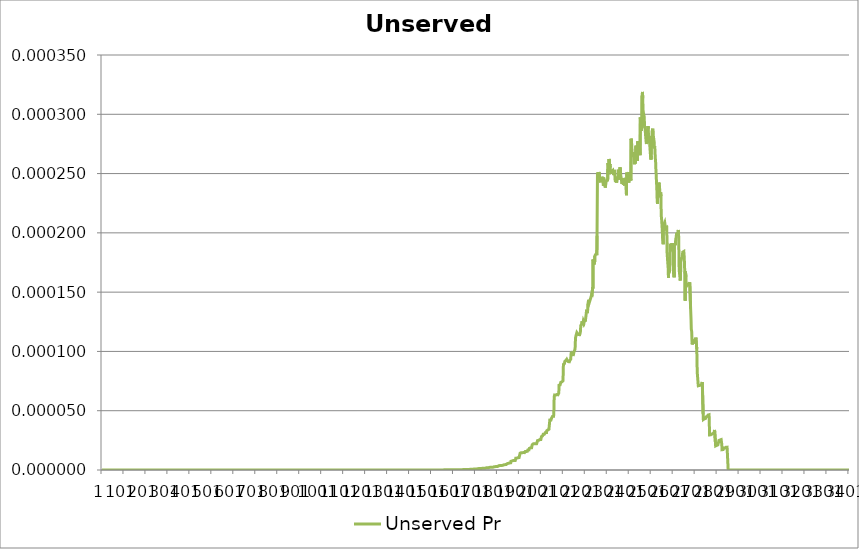
| Category | Unserved Pr |
|---|---|
| 0 | 0 |
| 1 | 0 |
| 2 | 0 |
| 3 | 0 |
| 4 | 0 |
| 5 | 0 |
| 6 | 0 |
| 7 | 0 |
| 8 | 0 |
| 9 | 0 |
| 10 | 0 |
| 11 | 0 |
| 12 | 0 |
| 13 | 0 |
| 14 | 0 |
| 15 | 0 |
| 16 | 0 |
| 17 | 0 |
| 18 | 0 |
| 19 | 0 |
| 20 | 0 |
| 21 | 0 |
| 22 | 0 |
| 23 | 0 |
| 24 | 0 |
| 25 | 0 |
| 26 | 0 |
| 27 | 0 |
| 28 | 0 |
| 29 | 0 |
| 30 | 0 |
| 31 | 0 |
| 32 | 0 |
| 33 | 0 |
| 34 | 0 |
| 35 | 0 |
| 36 | 0 |
| 37 | 0 |
| 38 | 0 |
| 39 | 0 |
| 40 | 0 |
| 41 | 0 |
| 42 | 0 |
| 43 | 0 |
| 44 | 0 |
| 45 | 0 |
| 46 | 0 |
| 47 | 0 |
| 48 | 0 |
| 49 | 0 |
| 50 | 0 |
| 51 | 0 |
| 52 | 0 |
| 53 | 0 |
| 54 | 0 |
| 55 | 0 |
| 56 | 0 |
| 57 | 0 |
| 58 | 0 |
| 59 | 0 |
| 60 | 0 |
| 61 | 0 |
| 62 | 0 |
| 63 | 0 |
| 64 | 0 |
| 65 | 0 |
| 66 | 0 |
| 67 | 0 |
| 68 | 0 |
| 69 | 0 |
| 70 | 0 |
| 71 | 0 |
| 72 | 0 |
| 73 | 0 |
| 74 | 0 |
| 75 | 0 |
| 76 | 0 |
| 77 | 0 |
| 78 | 0 |
| 79 | 0 |
| 80 | 0 |
| 81 | 0 |
| 82 | 0 |
| 83 | 0 |
| 84 | 0 |
| 85 | 0 |
| 86 | 0 |
| 87 | 0 |
| 88 | 0 |
| 89 | 0 |
| 90 | 0 |
| 91 | 0 |
| 92 | 0 |
| 93 | 0 |
| 94 | 0 |
| 95 | 0 |
| 96 | 0 |
| 97 | 0 |
| 98 | 0 |
| 99 | 0 |
| 100 | 0 |
| 101 | 0 |
| 102 | 0 |
| 103 | 0 |
| 104 | 0 |
| 105 | 0 |
| 106 | 0 |
| 107 | 0 |
| 108 | 0 |
| 109 | 0 |
| 110 | 0 |
| 111 | 0 |
| 112 | 0 |
| 113 | 0 |
| 114 | 0 |
| 115 | 0 |
| 116 | 0 |
| 117 | 0 |
| 118 | 0 |
| 119 | 0 |
| 120 | 0 |
| 121 | 0 |
| 122 | 0 |
| 123 | 0 |
| 124 | 0 |
| 125 | 0 |
| 126 | 0 |
| 127 | 0 |
| 128 | 0 |
| 129 | 0 |
| 130 | 0 |
| 131 | 0 |
| 132 | 0 |
| 133 | 0 |
| 134 | 0 |
| 135 | 0 |
| 136 | 0 |
| 137 | 0 |
| 138 | 0 |
| 139 | 0 |
| 140 | 0 |
| 141 | 0 |
| 142 | 0 |
| 143 | 0 |
| 144 | 0 |
| 145 | 0 |
| 146 | 0 |
| 147 | 0 |
| 148 | 0 |
| 149 | 0 |
| 150 | 0 |
| 151 | 0 |
| 152 | 0 |
| 153 | 0 |
| 154 | 0 |
| 155 | 0 |
| 156 | 0 |
| 157 | 0 |
| 158 | 0 |
| 159 | 0 |
| 160 | 0 |
| 161 | 0 |
| 162 | 0 |
| 163 | 0 |
| 164 | 0 |
| 165 | 0 |
| 166 | 0 |
| 167 | 0 |
| 168 | 0 |
| 169 | 0 |
| 170 | 0 |
| 171 | 0 |
| 172 | 0 |
| 173 | 0 |
| 174 | 0 |
| 175 | 0 |
| 176 | 0 |
| 177 | 0 |
| 178 | 0 |
| 179 | 0 |
| 180 | 0 |
| 181 | 0 |
| 182 | 0 |
| 183 | 0 |
| 184 | 0 |
| 185 | 0 |
| 186 | 0 |
| 187 | 0 |
| 188 | 0 |
| 189 | 0 |
| 190 | 0 |
| 191 | 0 |
| 192 | 0 |
| 193 | 0 |
| 194 | 0 |
| 195 | 0 |
| 196 | 0 |
| 197 | 0 |
| 198 | 0 |
| 199 | 0 |
| 200 | 0 |
| 201 | 0 |
| 202 | 0 |
| 203 | 0 |
| 204 | 0 |
| 205 | 0 |
| 206 | 0 |
| 207 | 0 |
| 208 | 0 |
| 209 | 0 |
| 210 | 0 |
| 211 | 0 |
| 212 | 0 |
| 213 | 0 |
| 214 | 0 |
| 215 | 0 |
| 216 | 0 |
| 217 | 0 |
| 218 | 0 |
| 219 | 0 |
| 220 | 0 |
| 221 | 0 |
| 222 | 0 |
| 223 | 0 |
| 224 | 0 |
| 225 | 0 |
| 226 | 0 |
| 227 | 0 |
| 228 | 0 |
| 229 | 0 |
| 230 | 0 |
| 231 | 0 |
| 232 | 0 |
| 233 | 0 |
| 234 | 0 |
| 235 | 0 |
| 236 | 0 |
| 237 | 0 |
| 238 | 0 |
| 239 | 0 |
| 240 | 0 |
| 241 | 0 |
| 242 | 0 |
| 243 | 0 |
| 244 | 0 |
| 245 | 0 |
| 246 | 0 |
| 247 | 0 |
| 248 | 0 |
| 249 | 0 |
| 250 | 0 |
| 251 | 0 |
| 252 | 0 |
| 253 | 0 |
| 254 | 0 |
| 255 | 0 |
| 256 | 0 |
| 257 | 0 |
| 258 | 0 |
| 259 | 0 |
| 260 | 0 |
| 261 | 0 |
| 262 | 0 |
| 263 | 0 |
| 264 | 0 |
| 265 | 0 |
| 266 | 0 |
| 267 | 0 |
| 268 | 0 |
| 269 | 0 |
| 270 | 0 |
| 271 | 0 |
| 272 | 0 |
| 273 | 0 |
| 274 | 0 |
| 275 | 0 |
| 276 | 0 |
| 277 | 0 |
| 278 | 0 |
| 279 | 0 |
| 280 | 0 |
| 281 | 0 |
| 282 | 0 |
| 283 | 0 |
| 284 | 0 |
| 285 | 0 |
| 286 | 0 |
| 287 | 0 |
| 288 | 0 |
| 289 | 0 |
| 290 | 0 |
| 291 | 0 |
| 292 | 0 |
| 293 | 0 |
| 294 | 0 |
| 295 | 0 |
| 296 | 0 |
| 297 | 0 |
| 298 | 0 |
| 299 | 0 |
| 300 | 0 |
| 301 | 0 |
| 302 | 0 |
| 303 | 0 |
| 304 | 0 |
| 305 | 0 |
| 306 | 0 |
| 307 | 0 |
| 308 | 0 |
| 309 | 0 |
| 310 | 0 |
| 311 | 0 |
| 312 | 0 |
| 313 | 0 |
| 314 | 0 |
| 315 | 0 |
| 316 | 0 |
| 317 | 0 |
| 318 | 0 |
| 319 | 0 |
| 320 | 0 |
| 321 | 0 |
| 322 | 0 |
| 323 | 0 |
| 324 | 0 |
| 325 | 0 |
| 326 | 0 |
| 327 | 0 |
| 328 | 0 |
| 329 | 0 |
| 330 | 0 |
| 331 | 0 |
| 332 | 0 |
| 333 | 0 |
| 334 | 0 |
| 335 | 0 |
| 336 | 0 |
| 337 | 0 |
| 338 | 0 |
| 339 | 0 |
| 340 | 0 |
| 341 | 0 |
| 342 | 0 |
| 343 | 0 |
| 344 | 0 |
| 345 | 0 |
| 346 | 0 |
| 347 | 0 |
| 348 | 0 |
| 349 | 0 |
| 350 | 0 |
| 351 | 0 |
| 352 | 0 |
| 353 | 0 |
| 354 | 0 |
| 355 | 0 |
| 356 | 0 |
| 357 | 0 |
| 358 | 0 |
| 359 | 0 |
| 360 | 0 |
| 361 | 0 |
| 362 | 0 |
| 363 | 0 |
| 364 | 0 |
| 365 | 0 |
| 366 | 0 |
| 367 | 0 |
| 368 | 0 |
| 369 | 0 |
| 370 | 0 |
| 371 | 0 |
| 372 | 0 |
| 373 | 0 |
| 374 | 0 |
| 375 | 0 |
| 376 | 0 |
| 377 | 0 |
| 378 | 0 |
| 379 | 0 |
| 380 | 0 |
| 381 | 0 |
| 382 | 0 |
| 383 | 0 |
| 384 | 0 |
| 385 | 0 |
| 386 | 0 |
| 387 | 0 |
| 388 | 0 |
| 389 | 0 |
| 390 | 0 |
| 391 | 0 |
| 392 | 0 |
| 393 | 0 |
| 394 | 0 |
| 395 | 0 |
| 396 | 0 |
| 397 | 0 |
| 398 | 0 |
| 399 | 0 |
| 400 | 0 |
| 401 | 0 |
| 402 | 0 |
| 403 | 0 |
| 404 | 0 |
| 405 | 0 |
| 406 | 0 |
| 407 | 0 |
| 408 | 0 |
| 409 | 0 |
| 410 | 0 |
| 411 | 0 |
| 412 | 0 |
| 413 | 0 |
| 414 | 0 |
| 415 | 0 |
| 416 | 0 |
| 417 | 0 |
| 418 | 0 |
| 419 | 0 |
| 420 | 0 |
| 421 | 0 |
| 422 | 0 |
| 423 | 0 |
| 424 | 0 |
| 425 | 0 |
| 426 | 0 |
| 427 | 0 |
| 428 | 0 |
| 429 | 0 |
| 430 | 0 |
| 431 | 0 |
| 432 | 0 |
| 433 | 0 |
| 434 | 0 |
| 435 | 0 |
| 436 | 0 |
| 437 | 0 |
| 438 | 0 |
| 439 | 0 |
| 440 | 0 |
| 441 | 0 |
| 442 | 0 |
| 443 | 0 |
| 444 | 0 |
| 445 | 0 |
| 446 | 0 |
| 447 | 0 |
| 448 | 0 |
| 449 | 0 |
| 450 | 0 |
| 451 | 0 |
| 452 | 0 |
| 453 | 0 |
| 454 | 0 |
| 455 | 0 |
| 456 | 0 |
| 457 | 0 |
| 458 | 0 |
| 459 | 0 |
| 460 | 0 |
| 461 | 0 |
| 462 | 0 |
| 463 | 0 |
| 464 | 0 |
| 465 | 0 |
| 466 | 0 |
| 467 | 0 |
| 468 | 0 |
| 469 | 0 |
| 470 | 0 |
| 471 | 0 |
| 472 | 0 |
| 473 | 0 |
| 474 | 0 |
| 475 | 0 |
| 476 | 0 |
| 477 | 0 |
| 478 | 0 |
| 479 | 0 |
| 480 | 0 |
| 481 | 0 |
| 482 | 0 |
| 483 | 0 |
| 484 | 0 |
| 485 | 0 |
| 486 | 0 |
| 487 | 0 |
| 488 | 0 |
| 489 | 0 |
| 490 | 0 |
| 491 | 0 |
| 492 | 0 |
| 493 | 0 |
| 494 | 0 |
| 495 | 0 |
| 496 | 0 |
| 497 | 0 |
| 498 | 0 |
| 499 | 0 |
| 500 | 0 |
| 501 | 0 |
| 502 | 0 |
| 503 | 0 |
| 504 | 0 |
| 505 | 0 |
| 506 | 0 |
| 507 | 0 |
| 508 | 0 |
| 509 | 0 |
| 510 | 0 |
| 511 | 0 |
| 512 | 0 |
| 513 | 0 |
| 514 | 0 |
| 515 | 0 |
| 516 | 0 |
| 517 | 0 |
| 518 | 0 |
| 519 | 0 |
| 520 | 0 |
| 521 | 0 |
| 522 | 0 |
| 523 | 0 |
| 524 | 0 |
| 525 | 0 |
| 526 | 0 |
| 527 | 0 |
| 528 | 0 |
| 529 | 0 |
| 530 | 0 |
| 531 | 0 |
| 532 | 0 |
| 533 | 0 |
| 534 | 0 |
| 535 | 0 |
| 536 | 0 |
| 537 | 0 |
| 538 | 0 |
| 539 | 0 |
| 540 | 0 |
| 541 | 0 |
| 542 | 0 |
| 543 | 0 |
| 544 | 0 |
| 545 | 0 |
| 546 | 0 |
| 547 | 0 |
| 548 | 0 |
| 549 | 0 |
| 550 | 0 |
| 551 | 0 |
| 552 | 0 |
| 553 | 0 |
| 554 | 0 |
| 555 | 0 |
| 556 | 0 |
| 557 | 0 |
| 558 | 0 |
| 559 | 0 |
| 560 | 0 |
| 561 | 0 |
| 562 | 0 |
| 563 | 0 |
| 564 | 0 |
| 565 | 0 |
| 566 | 0 |
| 567 | 0 |
| 568 | 0 |
| 569 | 0 |
| 570 | 0 |
| 571 | 0 |
| 572 | 0 |
| 573 | 0 |
| 574 | 0 |
| 575 | 0 |
| 576 | 0 |
| 577 | 0 |
| 578 | 0 |
| 579 | 0 |
| 580 | 0 |
| 581 | 0 |
| 582 | 0 |
| 583 | 0 |
| 584 | 0 |
| 585 | 0 |
| 586 | 0 |
| 587 | 0 |
| 588 | 0 |
| 589 | 0 |
| 590 | 0 |
| 591 | 0 |
| 592 | 0 |
| 593 | 0 |
| 594 | 0 |
| 595 | 0 |
| 596 | 0 |
| 597 | 0 |
| 598 | 0 |
| 599 | 0 |
| 600 | 0 |
| 601 | 0 |
| 602 | 0 |
| 603 | 0 |
| 604 | 0 |
| 605 | 0 |
| 606 | 0 |
| 607 | 0 |
| 608 | 0 |
| 609 | 0 |
| 610 | 0 |
| 611 | 0 |
| 612 | 0 |
| 613 | 0 |
| 614 | 0 |
| 615 | 0 |
| 616 | 0 |
| 617 | 0 |
| 618 | 0 |
| 619 | 0 |
| 620 | 0 |
| 621 | 0 |
| 622 | 0 |
| 623 | 0 |
| 624 | 0 |
| 625 | 0 |
| 626 | 0 |
| 627 | 0 |
| 628 | 0 |
| 629 | 0 |
| 630 | 0 |
| 631 | 0 |
| 632 | 0 |
| 633 | 0 |
| 634 | 0 |
| 635 | 0 |
| 636 | 0 |
| 637 | 0 |
| 638 | 0 |
| 639 | 0 |
| 640 | 0 |
| 641 | 0 |
| 642 | 0 |
| 643 | 0 |
| 644 | 0 |
| 645 | 0 |
| 646 | 0 |
| 647 | 0 |
| 648 | 0 |
| 649 | 0 |
| 650 | 0 |
| 651 | 0 |
| 652 | 0 |
| 653 | 0 |
| 654 | 0 |
| 655 | 0 |
| 656 | 0 |
| 657 | 0 |
| 658 | 0 |
| 659 | 0 |
| 660 | 0 |
| 661 | 0 |
| 662 | 0 |
| 663 | 0 |
| 664 | 0 |
| 665 | 0 |
| 666 | 0 |
| 667 | 0 |
| 668 | 0 |
| 669 | 0 |
| 670 | 0 |
| 671 | 0 |
| 672 | 0 |
| 673 | 0 |
| 674 | 0 |
| 675 | 0 |
| 676 | 0 |
| 677 | 0 |
| 678 | 0 |
| 679 | 0 |
| 680 | 0 |
| 681 | 0 |
| 682 | 0 |
| 683 | 0 |
| 684 | 0 |
| 685 | 0 |
| 686 | 0 |
| 687 | 0 |
| 688 | 0 |
| 689 | 0 |
| 690 | 0 |
| 691 | 0 |
| 692 | 0 |
| 693 | 0 |
| 694 | 0 |
| 695 | 0 |
| 696 | 0 |
| 697 | 0 |
| 698 | 0 |
| 699 | 0 |
| 700 | 0 |
| 701 | 0 |
| 702 | 0 |
| 703 | 0 |
| 704 | 0 |
| 705 | 0 |
| 706 | 0 |
| 707 | 0 |
| 708 | 0 |
| 709 | 0 |
| 710 | 0 |
| 711 | 0 |
| 712 | 0 |
| 713 | 0 |
| 714 | 0 |
| 715 | 0 |
| 716 | 0 |
| 717 | 0 |
| 718 | 0 |
| 719 | 0 |
| 720 | 0 |
| 721 | 0 |
| 722 | 0 |
| 723 | 0 |
| 724 | 0 |
| 725 | 0 |
| 726 | 0 |
| 727 | 0 |
| 728 | 0 |
| 729 | 0 |
| 730 | 0 |
| 731 | 0 |
| 732 | 0 |
| 733 | 0 |
| 734 | 0 |
| 735 | 0 |
| 736 | 0 |
| 737 | 0 |
| 738 | 0 |
| 739 | 0 |
| 740 | 0 |
| 741 | 0 |
| 742 | 0 |
| 743 | 0 |
| 744 | 0 |
| 745 | 0 |
| 746 | 0 |
| 747 | 0 |
| 748 | 0 |
| 749 | 0 |
| 750 | 0 |
| 751 | 0 |
| 752 | 0 |
| 753 | 0 |
| 754 | 0 |
| 755 | 0 |
| 756 | 0 |
| 757 | 0 |
| 758 | 0 |
| 759 | 0 |
| 760 | 0 |
| 761 | 0 |
| 762 | 0 |
| 763 | 0 |
| 764 | 0 |
| 765 | 0 |
| 766 | 0 |
| 767 | 0 |
| 768 | 0 |
| 769 | 0 |
| 770 | 0 |
| 771 | 0 |
| 772 | 0 |
| 773 | 0 |
| 774 | 0 |
| 775 | 0 |
| 776 | 0 |
| 777 | 0 |
| 778 | 0 |
| 779 | 0 |
| 780 | 0 |
| 781 | 0 |
| 782 | 0 |
| 783 | 0 |
| 784 | 0 |
| 785 | 0 |
| 786 | 0 |
| 787 | 0 |
| 788 | 0 |
| 789 | 0 |
| 790 | 0 |
| 791 | 0 |
| 792 | 0 |
| 793 | 0 |
| 794 | 0 |
| 795 | 0 |
| 796 | 0 |
| 797 | 0 |
| 798 | 0 |
| 799 | 0 |
| 800 | 0 |
| 801 | 0 |
| 802 | 0 |
| 803 | 0 |
| 804 | 0 |
| 805 | 0 |
| 806 | 0 |
| 807 | 0 |
| 808 | 0 |
| 809 | 0 |
| 810 | 0 |
| 811 | 0 |
| 812 | 0 |
| 813 | 0 |
| 814 | 0 |
| 815 | 0 |
| 816 | 0 |
| 817 | 0 |
| 818 | 0 |
| 819 | 0 |
| 820 | 0 |
| 821 | 0 |
| 822 | 0 |
| 823 | 0 |
| 824 | 0 |
| 825 | 0 |
| 826 | 0 |
| 827 | 0 |
| 828 | 0 |
| 829 | 0 |
| 830 | 0 |
| 831 | 0 |
| 832 | 0 |
| 833 | 0 |
| 834 | 0 |
| 835 | 0 |
| 836 | 0 |
| 837 | 0 |
| 838 | 0 |
| 839 | 0 |
| 840 | 0 |
| 841 | 0 |
| 842 | 0 |
| 843 | 0 |
| 844 | 0 |
| 845 | 0 |
| 846 | 0 |
| 847 | 0 |
| 848 | 0 |
| 849 | 0 |
| 850 | 0 |
| 851 | 0 |
| 852 | 0 |
| 853 | 0 |
| 854 | 0 |
| 855 | 0 |
| 856 | 0 |
| 857 | 0 |
| 858 | 0 |
| 859 | 0 |
| 860 | 0 |
| 861 | 0 |
| 862 | 0 |
| 863 | 0 |
| 864 | 0 |
| 865 | 0 |
| 866 | 0 |
| 867 | 0 |
| 868 | 0 |
| 869 | 0 |
| 870 | 0 |
| 871 | 0 |
| 872 | 0 |
| 873 | 0 |
| 874 | 0 |
| 875 | 0 |
| 876 | 0 |
| 877 | 0 |
| 878 | 0 |
| 879 | 0 |
| 880 | 0 |
| 881 | 0 |
| 882 | 0 |
| 883 | 0 |
| 884 | 0 |
| 885 | 0 |
| 886 | 0 |
| 887 | 0 |
| 888 | 0 |
| 889 | 0 |
| 890 | 0 |
| 891 | 0 |
| 892 | 0 |
| 893 | 0 |
| 894 | 0 |
| 895 | 0 |
| 896 | 0 |
| 897 | 0 |
| 898 | 0 |
| 899 | 0 |
| 900 | 0 |
| 901 | 0 |
| 902 | 0 |
| 903 | 0 |
| 904 | 0 |
| 905 | 0 |
| 906 | 0 |
| 907 | 0 |
| 908 | 0 |
| 909 | 0 |
| 910 | 0 |
| 911 | 0 |
| 912 | 0 |
| 913 | 0 |
| 914 | 0 |
| 915 | 0 |
| 916 | 0 |
| 917 | 0 |
| 918 | 0 |
| 919 | 0 |
| 920 | 0 |
| 921 | 0 |
| 922 | 0 |
| 923 | 0 |
| 924 | 0 |
| 925 | 0 |
| 926 | 0 |
| 927 | 0 |
| 928 | 0 |
| 929 | 0 |
| 930 | 0 |
| 931 | 0 |
| 932 | 0 |
| 933 | 0 |
| 934 | 0 |
| 935 | 0 |
| 936 | 0 |
| 937 | 0 |
| 938 | 0 |
| 939 | 0 |
| 940 | 0 |
| 941 | 0 |
| 942 | 0 |
| 943 | 0 |
| 944 | 0 |
| 945 | 0 |
| 946 | 0 |
| 947 | 0 |
| 948 | 0 |
| 949 | 0 |
| 950 | 0 |
| 951 | 0 |
| 952 | 0 |
| 953 | 0 |
| 954 | 0 |
| 955 | 0 |
| 956 | 0 |
| 957 | 0 |
| 958 | 0 |
| 959 | 0 |
| 960 | 0 |
| 961 | 0 |
| 962 | 0 |
| 963 | 0 |
| 964 | 0 |
| 965 | 0 |
| 966 | 0 |
| 967 | 0 |
| 968 | 0 |
| 969 | 0 |
| 970 | 0 |
| 971 | 0 |
| 972 | 0 |
| 973 | 0 |
| 974 | 0 |
| 975 | 0 |
| 976 | 0 |
| 977 | 0 |
| 978 | 0 |
| 979 | 0 |
| 980 | 0 |
| 981 | 0 |
| 982 | 0 |
| 983 | 0 |
| 984 | 0 |
| 985 | 0 |
| 986 | 0 |
| 987 | 0 |
| 988 | 0 |
| 989 | 0 |
| 990 | 0 |
| 991 | 0 |
| 992 | 0 |
| 993 | 0 |
| 994 | 0 |
| 995 | 0 |
| 996 | 0 |
| 997 | 0 |
| 998 | 0 |
| 999 | 0 |
| 1000 | 0 |
| 1001 | 0 |
| 1002 | 0 |
| 1003 | 0 |
| 1004 | 0 |
| 1005 | 0 |
| 1006 | 0 |
| 1007 | 0 |
| 1008 | 0 |
| 1009 | 0 |
| 1010 | 0 |
| 1011 | 0 |
| 1012 | 0 |
| 1013 | 0 |
| 1014 | 0 |
| 1015 | 0 |
| 1016 | 0 |
| 1017 | 0 |
| 1018 | 0 |
| 1019 | 0 |
| 1020 | 0 |
| 1021 | 0 |
| 1022 | 0 |
| 1023 | 0 |
| 1024 | 0 |
| 1025 | 0 |
| 1026 | 0 |
| 1027 | 0 |
| 1028 | 0 |
| 1029 | 0 |
| 1030 | 0 |
| 1031 | 0 |
| 1032 | 0 |
| 1033 | 0 |
| 1034 | 0 |
| 1035 | 0 |
| 1036 | 0 |
| 1037 | 0 |
| 1038 | 0 |
| 1039 | 0 |
| 1040 | 0 |
| 1041 | 0 |
| 1042 | 0 |
| 1043 | 0 |
| 1044 | 0 |
| 1045 | 0 |
| 1046 | 0 |
| 1047 | 0 |
| 1048 | 0 |
| 1049 | 0 |
| 1050 | 0 |
| 1051 | 0 |
| 1052 | 0 |
| 1053 | 0 |
| 1054 | 0 |
| 1055 | 0 |
| 1056 | 0 |
| 1057 | 0 |
| 1058 | 0 |
| 1059 | 0 |
| 1060 | 0 |
| 1061 | 0 |
| 1062 | 0 |
| 1063 | 0 |
| 1064 | 0 |
| 1065 | 0 |
| 1066 | 0 |
| 1067 | 0 |
| 1068 | 0 |
| 1069 | 0 |
| 1070 | 0 |
| 1071 | 0 |
| 1072 | 0 |
| 1073 | 0 |
| 1074 | 0 |
| 1075 | 0 |
| 1076 | 0 |
| 1077 | 0 |
| 1078 | 0 |
| 1079 | 0 |
| 1080 | 0 |
| 1081 | 0 |
| 1082 | 0 |
| 1083 | 0 |
| 1084 | 0 |
| 1085 | 0 |
| 1086 | 0 |
| 1087 | 0 |
| 1088 | 0 |
| 1089 | 0 |
| 1090 | 0 |
| 1091 | 0 |
| 1092 | 0 |
| 1093 | 0 |
| 1094 | 0 |
| 1095 | 0 |
| 1096 | 0 |
| 1097 | 0 |
| 1098 | 0 |
| 1099 | 0 |
| 1100 | 0 |
| 1101 | 0 |
| 1102 | 0 |
| 1103 | 0 |
| 1104 | 0 |
| 1105 | 0 |
| 1106 | 0 |
| 1107 | 0 |
| 1108 | 0 |
| 1109 | 0 |
| 1110 | 0 |
| 1111 | 0 |
| 1112 | 0 |
| 1113 | 0 |
| 1114 | 0 |
| 1115 | 0 |
| 1116 | 0 |
| 1117 | 0 |
| 1118 | 0 |
| 1119 | 0 |
| 1120 | 0 |
| 1121 | 0 |
| 1122 | 0 |
| 1123 | 0 |
| 1124 | 0 |
| 1125 | 0 |
| 1126 | 0 |
| 1127 | 0 |
| 1128 | 0 |
| 1129 | 0 |
| 1130 | 0 |
| 1131 | 0 |
| 1132 | 0 |
| 1133 | 0 |
| 1134 | 0 |
| 1135 | 0 |
| 1136 | 0 |
| 1137 | 0 |
| 1138 | 0 |
| 1139 | 0 |
| 1140 | 0 |
| 1141 | 0 |
| 1142 | 0 |
| 1143 | 0 |
| 1144 | 0 |
| 1145 | 0 |
| 1146 | 0 |
| 1147 | 0 |
| 1148 | 0 |
| 1149 | 0 |
| 1150 | 0 |
| 1151 | 0 |
| 1152 | 0 |
| 1153 | 0 |
| 1154 | 0 |
| 1155 | 0 |
| 1156 | 0 |
| 1157 | 0 |
| 1158 | 0 |
| 1159 | 0 |
| 1160 | 0 |
| 1161 | 0 |
| 1162 | 0 |
| 1163 | 0 |
| 1164 | 0 |
| 1165 | 0 |
| 1166 | 0 |
| 1167 | 0 |
| 1168 | 0 |
| 1169 | 0 |
| 1170 | 0 |
| 1171 | 0 |
| 1172 | 0 |
| 1173 | 0 |
| 1174 | 0 |
| 1175 | 0 |
| 1176 | 0 |
| 1177 | 0 |
| 1178 | 0 |
| 1179 | 0 |
| 1180 | 0 |
| 1181 | 0 |
| 1182 | 0 |
| 1183 | 0 |
| 1184 | 0 |
| 1185 | 0 |
| 1186 | 0 |
| 1187 | 0 |
| 1188 | 0 |
| 1189 | 0 |
| 1190 | 0 |
| 1191 | 0 |
| 1192 | 0 |
| 1193 | 0 |
| 1194 | 0 |
| 1195 | 0 |
| 1196 | 0 |
| 1197 | 0 |
| 1198 | 0 |
| 1199 | 0 |
| 1200 | 0 |
| 1201 | 0 |
| 1202 | 0 |
| 1203 | 0 |
| 1204 | 0 |
| 1205 | 0 |
| 1206 | 0 |
| 1207 | 0 |
| 1208 | 0 |
| 1209 | 0 |
| 1210 | 0 |
| 1211 | 0 |
| 1212 | 0 |
| 1213 | 0 |
| 1214 | 0 |
| 1215 | 0 |
| 1216 | 0 |
| 1217 | 0 |
| 1218 | 0 |
| 1219 | 0 |
| 1220 | 0 |
| 1221 | 0 |
| 1222 | 0 |
| 1223 | 0 |
| 1224 | 0 |
| 1225 | 0 |
| 1226 | 0 |
| 1227 | 0 |
| 1228 | 0 |
| 1229 | 0 |
| 1230 | 0 |
| 1231 | 0 |
| 1232 | 0 |
| 1233 | 0 |
| 1234 | 0 |
| 1235 | 0 |
| 1236 | 0 |
| 1237 | 0 |
| 1238 | 0 |
| 1239 | 0 |
| 1240 | 0 |
| 1241 | 0 |
| 1242 | 0 |
| 1243 | 0 |
| 1244 | 0 |
| 1245 | 0 |
| 1246 | 0 |
| 1247 | 0 |
| 1248 | 0 |
| 1249 | 0 |
| 1250 | 0 |
| 1251 | 0 |
| 1252 | 0 |
| 1253 | 0 |
| 1254 | 0 |
| 1255 | 0 |
| 1256 | 0 |
| 1257 | 0 |
| 1258 | 0 |
| 1259 | 0 |
| 1260 | 0 |
| 1261 | 0 |
| 1262 | 0 |
| 1263 | 0 |
| 1264 | 0 |
| 1265 | 0 |
| 1266 | 0 |
| 1267 | 0 |
| 1268 | 0 |
| 1269 | 0 |
| 1270 | 0 |
| 1271 | 0 |
| 1272 | 0 |
| 1273 | 0 |
| 1274 | 0 |
| 1275 | 0 |
| 1276 | 0 |
| 1277 | 0 |
| 1278 | 0 |
| 1279 | 0 |
| 1280 | 0 |
| 1281 | 0 |
| 1282 | 0 |
| 1283 | 0 |
| 1284 | 0 |
| 1285 | 0 |
| 1286 | 0 |
| 1287 | 0 |
| 1288 | 0 |
| 1289 | 0 |
| 1290 | 0 |
| 1291 | 0 |
| 1292 | 0 |
| 1293 | 0 |
| 1294 | 0 |
| 1295 | 0 |
| 1296 | 0 |
| 1297 | 0 |
| 1298 | 0 |
| 1299 | 0 |
| 1300 | 0 |
| 1301 | 0 |
| 1302 | 0 |
| 1303 | 0 |
| 1304 | 0 |
| 1305 | 0 |
| 1306 | 0 |
| 1307 | 0 |
| 1308 | 0 |
| 1309 | 0 |
| 1310 | 0 |
| 1311 | 0 |
| 1312 | 0 |
| 1313 | 0 |
| 1314 | 0 |
| 1315 | 0 |
| 1316 | 0 |
| 1317 | 0 |
| 1318 | 0 |
| 1319 | 0 |
| 1320 | 0 |
| 1321 | 0 |
| 1322 | 0 |
| 1323 | 0 |
| 1324 | 0 |
| 1325 | 0 |
| 1326 | 0 |
| 1327 | 0 |
| 1328 | 0 |
| 1329 | 0 |
| 1330 | 0 |
| 1331 | 0 |
| 1332 | 0 |
| 1333 | 0 |
| 1334 | 0 |
| 1335 | 0 |
| 1336 | 0 |
| 1337 | 0 |
| 1338 | 0 |
| 1339 | 0 |
| 1340 | 0 |
| 1341 | 0 |
| 1342 | 0 |
| 1343 | 0 |
| 1344 | 0 |
| 1345 | 0 |
| 1346 | 0 |
| 1347 | 0 |
| 1348 | 0 |
| 1349 | 0 |
| 1350 | 0 |
| 1351 | 0 |
| 1352 | 0 |
| 1353 | 0 |
| 1354 | 0 |
| 1355 | 0 |
| 1356 | 0 |
| 1357 | 0 |
| 1358 | 0 |
| 1359 | 0 |
| 1360 | 0 |
| 1361 | 0 |
| 1362 | 0 |
| 1363 | 0 |
| 1364 | 0 |
| 1365 | 0 |
| 1366 | 0 |
| 1367 | 0 |
| 1368 | 0 |
| 1369 | 0 |
| 1370 | 0 |
| 1371 | 0 |
| 1372 | 0 |
| 1373 | 0 |
| 1374 | 0 |
| 1375 | 0 |
| 1376 | 0 |
| 1377 | 0 |
| 1378 | 0 |
| 1379 | 0 |
| 1380 | 0 |
| 1381 | 0 |
| 1382 | 0 |
| 1383 | 0 |
| 1384 | 0 |
| 1385 | 0 |
| 1386 | 0 |
| 1387 | 0 |
| 1388 | 0 |
| 1389 | 0 |
| 1390 | 0 |
| 1391 | 0 |
| 1392 | 0 |
| 1393 | 0 |
| 1394 | 0 |
| 1395 | 0 |
| 1396 | 0 |
| 1397 | 0 |
| 1398 | 0 |
| 1399 | 0 |
| 1400 | 0 |
| 1401 | 0 |
| 1402 | 0 |
| 1403 | 0 |
| 1404 | 0 |
| 1405 | 0 |
| 1406 | 0 |
| 1407 | 0 |
| 1408 | 0 |
| 1409 | 0 |
| 1410 | 0 |
| 1411 | 0 |
| 1412 | 0 |
| 1413 | 0 |
| 1414 | 0 |
| 1415 | 0 |
| 1416 | 0 |
| 1417 | 0 |
| 1418 | 0 |
| 1419 | 0 |
| 1420 | 0 |
| 1421 | 0 |
| 1422 | 0 |
| 1423 | 0 |
| 1424 | 0 |
| 1425 | 0 |
| 1426 | 0 |
| 1427 | 0 |
| 1428 | 0 |
| 1429 | 0 |
| 1430 | 0 |
| 1431 | 0 |
| 1432 | 0 |
| 1433 | 0 |
| 1434 | 0 |
| 1435 | 0 |
| 1436 | 0 |
| 1437 | 0 |
| 1438 | 0 |
| 1439 | 0 |
| 1440 | 0 |
| 1441 | 0 |
| 1442 | 0 |
| 1443 | 0 |
| 1444 | 0 |
| 1445 | 0 |
| 1446 | 0 |
| 1447 | 0 |
| 1448 | 0 |
| 1449 | 0 |
| 1450 | 0 |
| 1451 | 0 |
| 1452 | 0 |
| 1453 | 0 |
| 1454 | 0 |
| 1455 | 0 |
| 1456 | 0 |
| 1457 | 0 |
| 1458 | 0 |
| 1459 | 0 |
| 1460 | 0 |
| 1461 | 0 |
| 1462 | 0 |
| 1463 | 0 |
| 1464 | 0 |
| 1465 | 0 |
| 1466 | 0 |
| 1467 | 0 |
| 1468 | 0 |
| 1469 | 0 |
| 1470 | 0 |
| 1471 | 0 |
| 1472 | 0 |
| 1473 | 0 |
| 1474 | 0 |
| 1475 | 0 |
| 1476 | 0 |
| 1477 | 0 |
| 1478 | 0 |
| 1479 | 0 |
| 1480 | 0 |
| 1481 | 0 |
| 1482 | 0 |
| 1483 | 0 |
| 1484 | 0 |
| 1485 | 0 |
| 1486 | 0 |
| 1487 | 0 |
| 1488 | 0 |
| 1489 | 0 |
| 1490 | 0 |
| 1491 | 0 |
| 1492 | 0 |
| 1493 | 0 |
| 1494 | 0 |
| 1495 | 0 |
| 1496 | 0 |
| 1497 | 0 |
| 1498 | 0 |
| 1499 | 0 |
| 1500 | 0 |
| 1501 | 0 |
| 1502 | 0 |
| 1503 | 0 |
| 1504 | 0 |
| 1505 | 0 |
| 1506 | 0 |
| 1507 | 0 |
| 1508 | 0 |
| 1509 | 0 |
| 1510 | 0 |
| 1511 | 0 |
| 1512 | 0 |
| 1513 | 0 |
| 1514 | 0 |
| 1515 | 0 |
| 1516 | 0 |
| 1517 | 0 |
| 1518 | 0 |
| 1519 | 0 |
| 1520 | 0 |
| 1521 | 0 |
| 1522 | 0 |
| 1523 | 0 |
| 1524 | 0 |
| 1525 | 0 |
| 1526 | 0 |
| 1527 | 0 |
| 1528 | 0 |
| 1529 | 0 |
| 1530 | 0 |
| 1531 | 0 |
| 1532 | 0 |
| 1533 | 0 |
| 1534 | 0 |
| 1535 | 0 |
| 1536 | 0 |
| 1537 | 0 |
| 1538 | 0 |
| 1539 | 0 |
| 1540 | 0 |
| 1541 | 0 |
| 1542 | 0 |
| 1543 | 0 |
| 1544 | 0 |
| 1545 | 0 |
| 1546 | 0 |
| 1547 | 0 |
| 1548 | 0 |
| 1549 | 0 |
| 1550 | 0 |
| 1551 | 0 |
| 1552 | 0 |
| 1553 | 0 |
| 1554 | 0 |
| 1555 | 0 |
| 1556 | 0 |
| 1557 | 0 |
| 1558 | 0 |
| 1559 | 0 |
| 1560 | 0 |
| 1561 | 0 |
| 1562 | 0 |
| 1563 | 0 |
| 1564 | 0 |
| 1565 | 0 |
| 1566 | 0 |
| 1567 | 0 |
| 1568 | 0 |
| 1569 | 0 |
| 1570 | 0 |
| 1571 | 0 |
| 1572 | 0 |
| 1573 | 0 |
| 1574 | 0 |
| 1575 | 0 |
| 1576 | 0 |
| 1577 | 0 |
| 1578 | 0 |
| 1579 | 0 |
| 1580 | 0 |
| 1581 | 0 |
| 1582 | 0 |
| 1583 | 0 |
| 1584 | 0 |
| 1585 | 0 |
| 1586 | 0 |
| 1587 | 0 |
| 1588 | 0 |
| 1589 | 0 |
| 1590 | 0 |
| 1591 | 0 |
| 1592 | 0 |
| 1593 | 0 |
| 1594 | 0 |
| 1595 | 0 |
| 1596 | 0 |
| 1597 | 0 |
| 1598 | 0 |
| 1599 | 0 |
| 1600 | 0 |
| 1601 | 0 |
| 1602 | 0 |
| 1603 | 0 |
| 1604 | 0 |
| 1605 | 0 |
| 1606 | 0 |
| 1607 | 0 |
| 1608 | 0 |
| 1609 | 0 |
| 1610 | 0 |
| 1611 | 0 |
| 1612 | 0 |
| 1613 | 0 |
| 1614 | 0 |
| 1615 | 0 |
| 1616 | 0 |
| 1617 | 0 |
| 1618 | 0 |
| 1619 | 0 |
| 1620 | 0 |
| 1621 | 0 |
| 1622 | 0 |
| 1623 | 0 |
| 1624 | 0 |
| 1625 | 0 |
| 1626 | 0 |
| 1627 | 0 |
| 1628 | 0 |
| 1629 | 0 |
| 1630 | 0 |
| 1631 | 0 |
| 1632 | 0 |
| 1633 | 0 |
| 1634 | 0 |
| 1635 | 0 |
| 1636 | 0 |
| 1637 | 0 |
| 1638 | 0 |
| 1639 | 0 |
| 1640 | 0 |
| 1641 | 0 |
| 1642 | 0 |
| 1643 | 0 |
| 1644 | 0 |
| 1645 | 0 |
| 1646 | 0 |
| 1647 | 0 |
| 1648 | 0 |
| 1649 | 0 |
| 1650 | 0 |
| 1651 | 0 |
| 1652 | 0 |
| 1653 | 0 |
| 1654 | 0 |
| 1655 | 0 |
| 1656 | 0 |
| 1657 | 0 |
| 1658 | 0 |
| 1659 | 0 |
| 1660 | 0 |
| 1661 | 0 |
| 1662 | 0 |
| 1663 | 0 |
| 1664 | 0 |
| 1665 | 0 |
| 1666 | 0 |
| 1667 | 0 |
| 1668 | 0 |
| 1669 | 0 |
| 1670 | 0 |
| 1671 | 0 |
| 1672 | 0 |
| 1673 | 0 |
| 1674 | 0 |
| 1675 | 0 |
| 1676 | 0 |
| 1677 | 0 |
| 1678 | 0 |
| 1679 | 0 |
| 1680 | 0 |
| 1681 | 0 |
| 1682 | 0 |
| 1683 | 0 |
| 1684 | 0 |
| 1685 | 0 |
| 1686 | 0 |
| 1687 | 0 |
| 1688 | 0 |
| 1689 | 0 |
| 1690 | 0 |
| 1691 | 0 |
| 1692 | 0 |
| 1693 | 0 |
| 1694 | 0 |
| 1695 | 0 |
| 1696 | 0 |
| 1697 | 0 |
| 1698 | 0 |
| 1699 | 0 |
| 1700 | 0 |
| 1701 | 0 |
| 1702 | 0 |
| 1703 | 0 |
| 1704 | 0 |
| 1705 | 0 |
| 1706 | 0 |
| 1707 | 0 |
| 1708 | 0 |
| 1709 | 0 |
| 1710 | 0 |
| 1711 | 0 |
| 1712 | 0 |
| 1713 | 0 |
| 1714 | 0 |
| 1715 | 0 |
| 1716 | 0 |
| 1717 | 0 |
| 1718 | 0 |
| 1719 | 0 |
| 1720 | 0 |
| 1721 | 0 |
| 1722 | 0 |
| 1723 | 0 |
| 1724 | 0 |
| 1725 | 0 |
| 1726 | 0 |
| 1727 | 0 |
| 1728 | 0 |
| 1729 | 0 |
| 1730 | 0 |
| 1731 | 0 |
| 1732 | 0 |
| 1733 | 0 |
| 1734 | 0 |
| 1735 | 0 |
| 1736 | 0 |
| 1737 | 0 |
| 1738 | 0 |
| 1739 | 0 |
| 1740 | 0 |
| 1741 | 0 |
| 1742 | 0 |
| 1743 | 0 |
| 1744 | 0 |
| 1745 | 0 |
| 1746 | 0 |
| 1747 | 0 |
| 1748 | 0 |
| 1749 | 0 |
| 1750 | 0 |
| 1751 | 0 |
| 1752 | 0 |
| 1753 | 0 |
| 1754 | 0 |
| 1755 | 0 |
| 1756 | 0 |
| 1757 | 0 |
| 1758 | 0 |
| 1759 | 0 |
| 1760 | 0 |
| 1761 | 0 |
| 1762 | 0 |
| 1763 | 0 |
| 1764 | 0 |
| 1765 | 0 |
| 1766 | 0 |
| 1767 | 0 |
| 1768 | 0 |
| 1769 | 0 |
| 1770 | 0 |
| 1771 | 0 |
| 1772 | 0 |
| 1773 | 0 |
| 1774 | 0 |
| 1775 | 0 |
| 1776 | 0 |
| 1777 | 0 |
| 1778 | 0 |
| 1779 | 0 |
| 1780 | 0 |
| 1781 | 0 |
| 1782 | 0 |
| 1783 | 0 |
| 1784 | 0 |
| 1785 | 0 |
| 1786 | 0 |
| 1787 | 0 |
| 1788 | 0 |
| 1789 | 0 |
| 1790 | 0 |
| 1791 | 0 |
| 1792 | 0 |
| 1793 | 0 |
| 1794 | 0 |
| 1795 | 0 |
| 1796 | 0 |
| 1797 | 0 |
| 1798 | 0 |
| 1799 | 0 |
| 1800 | 0 |
| 1801 | 0 |
| 1802 | 0 |
| 1803 | 0 |
| 1804 | 0 |
| 1805 | 0 |
| 1806 | 0 |
| 1807 | 0 |
| 1808 | 0 |
| 1809 | 0 |
| 1810 | 0 |
| 1811 | 0 |
| 1812 | 0 |
| 1813 | 0 |
| 1814 | 0 |
| 1815 | 0 |
| 1816 | 0 |
| 1817 | 0 |
| 1818 | 0 |
| 1819 | 0 |
| 1820 | 0 |
| 1821 | 0 |
| 1822 | 0 |
| 1823 | 0 |
| 1824 | 0 |
| 1825 | 0 |
| 1826 | 0 |
| 1827 | 0 |
| 1828 | 0 |
| 1829 | 0 |
| 1830 | 0 |
| 1831 | 0 |
| 1832 | 0 |
| 1833 | 0 |
| 1834 | 0 |
| 1835 | 0 |
| 1836 | 0 |
| 1837 | 0 |
| 1838 | 0 |
| 1839 | 0 |
| 1840 | 0 |
| 1841 | 0 |
| 1842 | 0 |
| 1843 | 0 |
| 1844 | 0 |
| 1845 | 0 |
| 1846 | 0 |
| 1847 | 0 |
| 1848 | 0 |
| 1849 | 0 |
| 1850 | 0 |
| 1851 | 0 |
| 1852 | 0 |
| 1853 | 0 |
| 1854 | 0 |
| 1855 | 0 |
| 1856 | 0 |
| 1857 | 0 |
| 1858 | 0 |
| 1859 | 0 |
| 1860 | 0 |
| 1861 | 0 |
| 1862 | 0 |
| 1863 | 0 |
| 1864 | 0 |
| 1865 | 0 |
| 1866 | 0 |
| 1867 | 0 |
| 1868 | 0 |
| 1869 | 0 |
| 1870 | 0 |
| 1871 | 0 |
| 1872 | 0 |
| 1873 | 0 |
| 1874 | 0 |
| 1875 | 0 |
| 1876 | 0 |
| 1877 | 0 |
| 1878 | 0 |
| 1879 | 0 |
| 1880 | 0 |
| 1881 | 0 |
| 1882 | 0 |
| 1883 | 0 |
| 1884 | 0 |
| 1885 | 0 |
| 1886 | 0 |
| 1887 | 0 |
| 1888 | 0 |
| 1889 | 0 |
| 1890 | 0 |
| 1891 | 0 |
| 1892 | 0 |
| 1893 | 0 |
| 1894 | 0 |
| 1895 | 0 |
| 1896 | 0 |
| 1897 | 0 |
| 1898 | 0 |
| 1899 | 0 |
| 1900 | 0 |
| 1901 | 0 |
| 1902 | 0 |
| 1903 | 0 |
| 1904 | 0 |
| 1905 | 0 |
| 1906 | 0 |
| 1907 | 0 |
| 1908 | 0 |
| 1909 | 0 |
| 1910 | 0 |
| 1911 | 0 |
| 1912 | 0 |
| 1913 | 0 |
| 1914 | 0 |
| 1915 | 0 |
| 1916 | 0 |
| 1917 | 0 |
| 1918 | 0 |
| 1919 | 0 |
| 1920 | 0 |
| 1921 | 0 |
| 1922 | 0 |
| 1923 | 0 |
| 1924 | 0 |
| 1925 | 0 |
| 1926 | 0 |
| 1927 | 0 |
| 1928 | 0 |
| 1929 | 0 |
| 1930 | 0 |
| 1931 | 0 |
| 1932 | 0 |
| 1933 | 0 |
| 1934 | 0 |
| 1935 | 0 |
| 1936 | 0 |
| 1937 | 0 |
| 1938 | 0 |
| 1939 | 0 |
| 1940 | 0 |
| 1941 | 0 |
| 1942 | 0 |
| 1943 | 0 |
| 1944 | 0 |
| 1945 | 0 |
| 1946 | 0 |
| 1947 | 0 |
| 1948 | 0 |
| 1949 | 0 |
| 1950 | 0 |
| 1951 | 0 |
| 1952 | 0 |
| 1953 | 0 |
| 1954 | 0 |
| 1955 | 0 |
| 1956 | 0 |
| 1957 | 0 |
| 1958 | 0 |
| 1959 | 0 |
| 1960 | 0 |
| 1961 | 0 |
| 1962 | 0 |
| 1963 | 0 |
| 1964 | 0 |
| 1965 | 0 |
| 1966 | 0 |
| 1967 | 0 |
| 1968 | 0 |
| 1969 | 0 |
| 1970 | 0 |
| 1971 | 0 |
| 1972 | 0 |
| 1973 | 0 |
| 1974 | 0 |
| 1975 | 0 |
| 1976 | 0 |
| 1977 | 0 |
| 1978 | 0 |
| 1979 | 0 |
| 1980 | 0 |
| 1981 | 0 |
| 1982 | 0 |
| 1983 | 0 |
| 1984 | 0 |
| 1985 | 0 |
| 1986 | 0 |
| 1987 | 0 |
| 1988 | 0 |
| 1989 | 0 |
| 1990 | 0 |
| 1991 | 0 |
| 1992 | 0 |
| 1993 | 0 |
| 1994 | 0 |
| 1995 | 0 |
| 1996 | 0 |
| 1997 | 0 |
| 1998 | 0 |
| 1999 | 0 |
| 2000 | 0 |
| 2001 | 0 |
| 2002 | 0 |
| 2003 | 0 |
| 2004 | 0 |
| 2005 | 0 |
| 2006 | 0 |
| 2007 | 0 |
| 2008 | 0 |
| 2009 | 0 |
| 2010 | 0 |
| 2011 | 0 |
| 2012 | 0 |
| 2013 | 0 |
| 2014 | 0 |
| 2015 | 0 |
| 2016 | 0 |
| 2017 | 0 |
| 2018 | 0 |
| 2019 | 0 |
| 2020 | 0 |
| 2021 | 0 |
| 2022 | 0 |
| 2023 | 0 |
| 2024 | 0 |
| 2025 | 0 |
| 2026 | 0 |
| 2027 | 0 |
| 2028 | 0 |
| 2029 | 0 |
| 2030 | 0 |
| 2031 | 0 |
| 2032 | 0 |
| 2033 | 0 |
| 2034 | 0 |
| 2035 | 0 |
| 2036 | 0 |
| 2037 | 0 |
| 2038 | 0 |
| 2039 | 0 |
| 2040 | 0 |
| 2041 | 0 |
| 2042 | 0 |
| 2043 | 0 |
| 2044 | 0 |
| 2045 | 0 |
| 2046 | 0 |
| 2047 | 0 |
| 2048 | 0 |
| 2049 | 0 |
| 2050 | 0 |
| 2051 | 0 |
| 2052 | 0 |
| 2053 | 0 |
| 2054 | 0 |
| 2055 | 0 |
| 2056 | 0 |
| 2057 | 0 |
| 2058 | 0 |
| 2059 | 0 |
| 2060 | 0 |
| 2061 | 0 |
| 2062 | 0 |
| 2063 | 0 |
| 2064 | 0 |
| 2065 | 0 |
| 2066 | 0 |
| 2067 | 0 |
| 2068 | 0 |
| 2069 | 0 |
| 2070 | 0 |
| 2071 | 0 |
| 2072 | 0 |
| 2073 | 0 |
| 2074 | 0 |
| 2075 | 0 |
| 2076 | 0 |
| 2077 | 0 |
| 2078 | 0 |
| 2079 | 0 |
| 2080 | 0 |
| 2081 | 0 |
| 2082 | 0 |
| 2083 | 0 |
| 2084 | 0 |
| 2085 | 0 |
| 2086 | 0 |
| 2087 | 0 |
| 2088 | 0 |
| 2089 | 0 |
| 2090 | 0 |
| 2091 | 0 |
| 2092 | 0 |
| 2093 | 0 |
| 2094 | 0 |
| 2095 | 0 |
| 2096 | 0 |
| 2097 | 0 |
| 2098 | 0 |
| 2099 | 0 |
| 2100 | 0 |
| 2101 | 0 |
| 2102 | 0 |
| 2103 | 0 |
| 2104 | 0 |
| 2105 | 0 |
| 2106 | 0 |
| 2107 | 0 |
| 2108 | 0 |
| 2109 | 0 |
| 2110 | 0 |
| 2111 | 0 |
| 2112 | 0 |
| 2113 | 0 |
| 2114 | 0 |
| 2115 | 0 |
| 2116 | 0 |
| 2117 | 0 |
| 2118 | 0 |
| 2119 | 0 |
| 2120 | 0 |
| 2121 | 0 |
| 2122 | 0 |
| 2123 | 0 |
| 2124 | 0 |
| 2125 | 0 |
| 2126 | 0 |
| 2127 | 0 |
| 2128 | 0 |
| 2129 | 0 |
| 2130 | 0 |
| 2131 | 0 |
| 2132 | 0 |
| 2133 | 0 |
| 2134 | 0 |
| 2135 | 0 |
| 2136 | 0 |
| 2137 | 0 |
| 2138 | 0 |
| 2139 | 0 |
| 2140 | 0 |
| 2141 | 0 |
| 2142 | 0 |
| 2143 | 0 |
| 2144 | 0 |
| 2145 | 0 |
| 2146 | 0 |
| 2147 | 0 |
| 2148 | 0 |
| 2149 | 0 |
| 2150 | 0 |
| 2151 | 0 |
| 2152 | 0 |
| 2153 | 0 |
| 2154 | 0 |
| 2155 | 0 |
| 2156 | 0 |
| 2157 | 0 |
| 2158 | 0 |
| 2159 | 0 |
| 2160 | 0 |
| 2161 | 0 |
| 2162 | 0 |
| 2163 | 0 |
| 2164 | 0 |
| 2165 | 0 |
| 2166 | 0 |
| 2167 | 0 |
| 2168 | 0 |
| 2169 | 0 |
| 2170 | 0 |
| 2171 | 0 |
| 2172 | 0 |
| 2173 | 0 |
| 2174 | 0 |
| 2175 | 0 |
| 2176 | 0 |
| 2177 | 0 |
| 2178 | 0 |
| 2179 | 0 |
| 2180 | 0 |
| 2181 | 0 |
| 2182 | 0 |
| 2183 | 0 |
| 2184 | 0 |
| 2185 | 0 |
| 2186 | 0 |
| 2187 | 0 |
| 2188 | 0 |
| 2189 | 0 |
| 2190 | 0 |
| 2191 | 0 |
| 2192 | 0 |
| 2193 | 0 |
| 2194 | 0 |
| 2195 | 0 |
| 2196 | 0 |
| 2197 | 0 |
| 2198 | 0 |
| 2199 | 0 |
| 2200 | 0 |
| 2201 | 0 |
| 2202 | 0 |
| 2203 | 0 |
| 2204 | 0 |
| 2205 | 0 |
| 2206 | 0 |
| 2207 | 0 |
| 2208 | 0 |
| 2209 | 0 |
| 2210 | 0 |
| 2211 | 0 |
| 2212 | 0 |
| 2213 | 0 |
| 2214 | 0 |
| 2215 | 0 |
| 2216 | 0 |
| 2217 | 0 |
| 2218 | 0 |
| 2219 | 0 |
| 2220 | 0 |
| 2221 | 0 |
| 2222 | 0 |
| 2223 | 0 |
| 2224 | 0 |
| 2225 | 0 |
| 2226 | 0 |
| 2227 | 0 |
| 2228 | 0 |
| 2229 | 0 |
| 2230 | 0 |
| 2231 | 0 |
| 2232 | 0 |
| 2233 | 0 |
| 2234 | 0 |
| 2235 | 0 |
| 2236 | 0 |
| 2237 | 0 |
| 2238 | 0 |
| 2239 | 0 |
| 2240 | 0 |
| 2241 | 0 |
| 2242 | 0 |
| 2243 | 0 |
| 2244 | 0 |
| 2245 | 0 |
| 2246 | 0 |
| 2247 | 0 |
| 2248 | 0 |
| 2249 | 0 |
| 2250 | 0 |
| 2251 | 0 |
| 2252 | 0 |
| 2253 | 0 |
| 2254 | 0 |
| 2255 | 0 |
| 2256 | 0 |
| 2257 | 0 |
| 2258 | 0 |
| 2259 | 0 |
| 2260 | 0 |
| 2261 | 0 |
| 2262 | 0 |
| 2263 | 0 |
| 2264 | 0 |
| 2265 | 0 |
| 2266 | 0 |
| 2267 | 0 |
| 2268 | 0 |
| 2269 | 0 |
| 2270 | 0 |
| 2271 | 0 |
| 2272 | 0 |
| 2273 | 0 |
| 2274 | 0 |
| 2275 | 0 |
| 2276 | 0 |
| 2277 | 0 |
| 2278 | 0 |
| 2279 | 0 |
| 2280 | 0 |
| 2281 | 0 |
| 2282 | 0 |
| 2283 | 0 |
| 2284 | 0 |
| 2285 | 0 |
| 2286 | 0 |
| 2287 | 0 |
| 2288 | 0 |
| 2289 | 0 |
| 2290 | 0 |
| 2291 | 0 |
| 2292 | 0 |
| 2293 | 0 |
| 2294 | 0 |
| 2295 | 0 |
| 2296 | 0 |
| 2297 | 0 |
| 2298 | 0 |
| 2299 | 0 |
| 2300 | 0 |
| 2301 | 0 |
| 2302 | 0 |
| 2303 | 0 |
| 2304 | 0 |
| 2305 | 0 |
| 2306 | 0 |
| 2307 | 0 |
| 2308 | 0 |
| 2309 | 0 |
| 2310 | 0 |
| 2311 | 0 |
| 2312 | 0 |
| 2313 | 0 |
| 2314 | 0 |
| 2315 | 0 |
| 2316 | 0 |
| 2317 | 0 |
| 2318 | 0 |
| 2319 | 0 |
| 2320 | 0 |
| 2321 | 0 |
| 2322 | 0 |
| 2323 | 0 |
| 2324 | 0 |
| 2325 | 0 |
| 2326 | 0 |
| 2327 | 0 |
| 2328 | 0 |
| 2329 | 0 |
| 2330 | 0 |
| 2331 | 0 |
| 2332 | 0 |
| 2333 | 0 |
| 2334 | 0 |
| 2335 | 0 |
| 2336 | 0 |
| 2337 | 0 |
| 2338 | 0 |
| 2339 | 0 |
| 2340 | 0 |
| 2341 | 0 |
| 2342 | 0 |
| 2343 | 0 |
| 2344 | 0 |
| 2345 | 0 |
| 2346 | 0 |
| 2347 | 0 |
| 2348 | 0 |
| 2349 | 0 |
| 2350 | 0 |
| 2351 | 0 |
| 2352 | 0 |
| 2353 | 0 |
| 2354 | 0 |
| 2355 | 0 |
| 2356 | 0 |
| 2357 | 0 |
| 2358 | 0 |
| 2359 | 0 |
| 2360 | 0 |
| 2361 | 0 |
| 2362 | 0 |
| 2363 | 0 |
| 2364 | 0 |
| 2365 | 0 |
| 2366 | 0 |
| 2367 | 0 |
| 2368 | 0 |
| 2369 | 0 |
| 2370 | 0 |
| 2371 | 0 |
| 2372 | 0 |
| 2373 | 0 |
| 2374 | 0 |
| 2375 | 0 |
| 2376 | 0 |
| 2377 | 0 |
| 2378 | 0 |
| 2379 | 0 |
| 2380 | 0 |
| 2381 | 0 |
| 2382 | 0 |
| 2383 | 0 |
| 2384 | 0 |
| 2385 | 0 |
| 2386 | 0 |
| 2387 | 0 |
| 2388 | 0 |
| 2389 | 0 |
| 2390 | 0 |
| 2391 | 0 |
| 2392 | 0 |
| 2393 | 0 |
| 2394 | 0 |
| 2395 | 0 |
| 2396 | 0 |
| 2397 | 0 |
| 2398 | 0 |
| 2399 | 0 |
| 2400 | 0 |
| 2401 | 0 |
| 2402 | 0 |
| 2403 | 0 |
| 2404 | 0 |
| 2405 | 0 |
| 2406 | 0 |
| 2407 | 0 |
| 2408 | 0 |
| 2409 | 0 |
| 2410 | 0 |
| 2411 | 0 |
| 2412 | 0 |
| 2413 | 0 |
| 2414 | 0 |
| 2415 | 0 |
| 2416 | 0 |
| 2417 | 0 |
| 2418 | 0 |
| 2419 | 0 |
| 2420 | 0 |
| 2421 | 0 |
| 2422 | 0 |
| 2423 | 0 |
| 2424 | 0 |
| 2425 | 0 |
| 2426 | 0 |
| 2427 | 0 |
| 2428 | 0 |
| 2429 | 0 |
| 2430 | 0 |
| 2431 | 0 |
| 2432 | 0 |
| 2433 | 0 |
| 2434 | 0 |
| 2435 | 0 |
| 2436 | 0 |
| 2437 | 0 |
| 2438 | 0 |
| 2439 | 0 |
| 2440 | 0 |
| 2441 | 0 |
| 2442 | 0 |
| 2443 | 0 |
| 2444 | 0 |
| 2445 | 0 |
| 2446 | 0 |
| 2447 | 0 |
| 2448 | 0 |
| 2449 | 0 |
| 2450 | 0 |
| 2451 | 0 |
| 2452 | 0 |
| 2453 | 0 |
| 2454 | 0 |
| 2455 | 0 |
| 2456 | 0 |
| 2457 | 0 |
| 2458 | 0 |
| 2459 | 0 |
| 2460 | 0 |
| 2461 | 0 |
| 2462 | 0 |
| 2463 | 0 |
| 2464 | 0 |
| 2465 | 0 |
| 2466 | 0 |
| 2467 | 0 |
| 2468 | 0 |
| 2469 | 0 |
| 2470 | 0 |
| 2471 | 0 |
| 2472 | 0 |
| 2473 | 0 |
| 2474 | 0 |
| 2475 | 0 |
| 2476 | 0 |
| 2477 | 0 |
| 2478 | 0 |
| 2479 | 0 |
| 2480 | 0 |
| 2481 | 0 |
| 2482 | 0 |
| 2483 | 0 |
| 2484 | 0 |
| 2485 | 0 |
| 2486 | 0 |
| 2487 | 0 |
| 2488 | 0 |
| 2489 | 0 |
| 2490 | 0 |
| 2491 | 0 |
| 2492 | 0 |
| 2493 | 0 |
| 2494 | 0 |
| 2495 | 0 |
| 2496 | 0 |
| 2497 | 0 |
| 2498 | 0 |
| 2499 | 0 |
| 2500 | 0 |
| 2501 | 0 |
| 2502 | 0 |
| 2503 | 0 |
| 2504 | 0 |
| 2505 | 0 |
| 2506 | 0 |
| 2507 | 0 |
| 2508 | 0 |
| 2509 | 0 |
| 2510 | 0 |
| 2511 | 0 |
| 2512 | 0 |
| 2513 | 0 |
| 2514 | 0 |
| 2515 | 0 |
| 2516 | 0 |
| 2517 | 0 |
| 2518 | 0 |
| 2519 | 0 |
| 2520 | 0 |
| 2521 | 0 |
| 2522 | 0 |
| 2523 | 0 |
| 2524 | 0 |
| 2525 | 0 |
| 2526 | 0 |
| 2527 | 0 |
| 2528 | 0 |
| 2529 | 0 |
| 2530 | 0 |
| 2531 | 0 |
| 2532 | 0 |
| 2533 | 0 |
| 2534 | 0 |
| 2535 | 0 |
| 2536 | 0 |
| 2537 | 0 |
| 2538 | 0 |
| 2539 | 0 |
| 2540 | 0 |
| 2541 | 0 |
| 2542 | 0 |
| 2543 | 0 |
| 2544 | 0 |
| 2545 | 0 |
| 2546 | 0 |
| 2547 | 0 |
| 2548 | 0 |
| 2549 | 0 |
| 2550 | 0 |
| 2551 | 0 |
| 2552 | 0 |
| 2553 | 0 |
| 2554 | 0 |
| 2555 | 0 |
| 2556 | 0 |
| 2557 | 0 |
| 2558 | 0 |
| 2559 | 0 |
| 2560 | 0 |
| 2561 | 0 |
| 2562 | 0 |
| 2563 | 0 |
| 2564 | 0 |
| 2565 | 0 |
| 2566 | 0 |
| 2567 | 0 |
| 2568 | 0 |
| 2569 | 0 |
| 2570 | 0 |
| 2571 | 0 |
| 2572 | 0 |
| 2573 | 0 |
| 2574 | 0 |
| 2575 | 0 |
| 2576 | 0 |
| 2577 | 0 |
| 2578 | 0 |
| 2579 | 0 |
| 2580 | 0 |
| 2581 | 0 |
| 2582 | 0 |
| 2583 | 0 |
| 2584 | 0 |
| 2585 | 0 |
| 2586 | 0 |
| 2587 | 0 |
| 2588 | 0 |
| 2589 | 0 |
| 2590 | 0 |
| 2591 | 0 |
| 2592 | 0 |
| 2593 | 0 |
| 2594 | 0 |
| 2595 | 0 |
| 2596 | 0 |
| 2597 | 0 |
| 2598 | 0 |
| 2599 | 0 |
| 2600 | 0 |
| 2601 | 0 |
| 2602 | 0 |
| 2603 | 0 |
| 2604 | 0 |
| 2605 | 0 |
| 2606 | 0 |
| 2607 | 0 |
| 2608 | 0 |
| 2609 | 0 |
| 2610 | 0 |
| 2611 | 0 |
| 2612 | 0 |
| 2613 | 0 |
| 2614 | 0 |
| 2615 | 0 |
| 2616 | 0 |
| 2617 | 0 |
| 2618 | 0 |
| 2619 | 0 |
| 2620 | 0 |
| 2621 | 0 |
| 2622 | 0 |
| 2623 | 0 |
| 2624 | 0 |
| 2625 | 0 |
| 2626 | 0 |
| 2627 | 0 |
| 2628 | 0 |
| 2629 | 0 |
| 2630 | 0 |
| 2631 | 0 |
| 2632 | 0 |
| 2633 | 0 |
| 2634 | 0 |
| 2635 | 0 |
| 2636 | 0 |
| 2637 | 0 |
| 2638 | 0 |
| 2639 | 0 |
| 2640 | 0 |
| 2641 | 0 |
| 2642 | 0 |
| 2643 | 0 |
| 2644 | 0 |
| 2645 | 0 |
| 2646 | 0 |
| 2647 | 0 |
| 2648 | 0 |
| 2649 | 0 |
| 2650 | 0 |
| 2651 | 0 |
| 2652 | 0 |
| 2653 | 0 |
| 2654 | 0 |
| 2655 | 0 |
| 2656 | 0 |
| 2657 | 0 |
| 2658 | 0 |
| 2659 | 0 |
| 2660 | 0 |
| 2661 | 0 |
| 2662 | 0 |
| 2663 | 0 |
| 2664 | 0 |
| 2665 | 0 |
| 2666 | 0 |
| 2667 | 0 |
| 2668 | 0 |
| 2669 | 0 |
| 2670 | 0 |
| 2671 | 0 |
| 2672 | 0 |
| 2673 | 0 |
| 2674 | 0 |
| 2675 | 0 |
| 2676 | 0 |
| 2677 | 0 |
| 2678 | 0 |
| 2679 | 0 |
| 2680 | 0 |
| 2681 | 0 |
| 2682 | 0 |
| 2683 | 0 |
| 2684 | 0 |
| 2685 | 0 |
| 2686 | 0 |
| 2687 | 0 |
| 2688 | 0 |
| 2689 | 0 |
| 2690 | 0 |
| 2691 | 0 |
| 2692 | 0 |
| 2693 | 0 |
| 2694 | 0 |
| 2695 | 0 |
| 2696 | 0 |
| 2697 | 0 |
| 2698 | 0 |
| 2699 | 0 |
| 2700 | 0 |
| 2701 | 0 |
| 2702 | 0 |
| 2703 | 0 |
| 2704 | 0 |
| 2705 | 0 |
| 2706 | 0 |
| 2707 | 0 |
| 2708 | 0 |
| 2709 | 0 |
| 2710 | 0 |
| 2711 | 0 |
| 2712 | 0 |
| 2713 | 0 |
| 2714 | 0 |
| 2715 | 0 |
| 2716 | 0 |
| 2717 | 0 |
| 2718 | 0 |
| 2719 | 0 |
| 2720 | 0 |
| 2721 | 0 |
| 2722 | 0 |
| 2723 | 0 |
| 2724 | 0 |
| 2725 | 0 |
| 2726 | 0 |
| 2727 | 0 |
| 2728 | 0 |
| 2729 | 0 |
| 2730 | 0 |
| 2731 | 0 |
| 2732 | 0 |
| 2733 | 0 |
| 2734 | 0 |
| 2735 | 0 |
| 2736 | 0 |
| 2737 | 0 |
| 2738 | 0 |
| 2739 | 0 |
| 2740 | 0 |
| 2741 | 0 |
| 2742 | 0 |
| 2743 | 0 |
| 2744 | 0 |
| 2745 | 0 |
| 2746 | 0 |
| 2747 | 0 |
| 2748 | 0 |
| 2749 | 0 |
| 2750 | 0 |
| 2751 | 0 |
| 2752 | 0 |
| 2753 | 0 |
| 2754 | 0 |
| 2755 | 0 |
| 2756 | 0 |
| 2757 | 0 |
| 2758 | 0 |
| 2759 | 0 |
| 2760 | 0 |
| 2761 | 0 |
| 2762 | 0 |
| 2763 | 0 |
| 2764 | 0 |
| 2765 | 0 |
| 2766 | 0 |
| 2767 | 0 |
| 2768 | 0 |
| 2769 | 0 |
| 2770 | 0 |
| 2771 | 0 |
| 2772 | 0 |
| 2773 | 0 |
| 2774 | 0 |
| 2775 | 0 |
| 2776 | 0 |
| 2777 | 0 |
| 2778 | 0 |
| 2779 | 0 |
| 2780 | 0 |
| 2781 | 0 |
| 2782 | 0 |
| 2783 | 0 |
| 2784 | 0 |
| 2785 | 0 |
| 2786 | 0 |
| 2787 | 0 |
| 2788 | 0 |
| 2789 | 0 |
| 2790 | 0 |
| 2791 | 0 |
| 2792 | 0 |
| 2793 | 0 |
| 2794 | 0 |
| 2795 | 0 |
| 2796 | 0 |
| 2797 | 0 |
| 2798 | 0 |
| 2799 | 0 |
| 2800 | 0 |
| 2801 | 0 |
| 2802 | 0 |
| 2803 | 0 |
| 2804 | 0 |
| 2805 | 0 |
| 2806 | 0 |
| 2807 | 0 |
| 2808 | 0 |
| 2809 | 0 |
| 2810 | 0 |
| 2811 | 0 |
| 2812 | 0 |
| 2813 | 0 |
| 2814 | 0 |
| 2815 | 0 |
| 2816 | 0 |
| 2817 | 0 |
| 2818 | 0 |
| 2819 | 0 |
| 2820 | 0 |
| 2821 | 0 |
| 2822 | 0 |
| 2823 | 0 |
| 2824 | 0 |
| 2825 | 0 |
| 2826 | 0 |
| 2827 | 0 |
| 2828 | 0 |
| 2829 | 0 |
| 2830 | 0 |
| 2831 | 0 |
| 2832 | 0 |
| 2833 | 0 |
| 2834 | 0 |
| 2835 | 0 |
| 2836 | 0 |
| 2837 | 0 |
| 2838 | 0 |
| 2839 | 0 |
| 2840 | 0 |
| 2841 | 0 |
| 2842 | 0 |
| 2843 | 0 |
| 2844 | 0 |
| 2845 | 0 |
| 2846 | 0 |
| 2847 | 0 |
| 2848 | 0 |
| 2849 | 0 |
| 2850 | 0 |
| 2851 | 0 |
| 2852 | 0 |
| 2853 | 0 |
| 2854 | 0 |
| 2855 | 0 |
| 2856 | 0 |
| 2857 | 0 |
| 2858 | 0 |
| 2859 | 0 |
| 2860 | 0 |
| 2861 | 0 |
| 2862 | 0 |
| 2863 | 0 |
| 2864 | 0 |
| 2865 | 0 |
| 2866 | 0 |
| 2867 | 0 |
| 2868 | 0 |
| 2869 | 0 |
| 2870 | 0 |
| 2871 | 0 |
| 2872 | 0 |
| 2873 | 0 |
| 2874 | 0 |
| 2875 | 0 |
| 2876 | 0 |
| 2877 | 0 |
| 2878 | 0 |
| 2879 | 0 |
| 2880 | 0 |
| 2881 | 0 |
| 2882 | 0 |
| 2883 | 0 |
| 2884 | 0 |
| 2885 | 0 |
| 2886 | 0 |
| 2887 | 0 |
| 2888 | 0 |
| 2889 | 0 |
| 2890 | 0 |
| 2891 | 0 |
| 2892 | 0 |
| 2893 | 0 |
| 2894 | 0 |
| 2895 | 0 |
| 2896 | 0 |
| 2897 | 0 |
| 2898 | 0 |
| 2899 | 0 |
| 2900 | 0 |
| 2901 | 0 |
| 2902 | 0 |
| 2903 | 0 |
| 2904 | 0 |
| 2905 | 0 |
| 2906 | 0 |
| 2907 | 0 |
| 2908 | 0 |
| 2909 | 0 |
| 2910 | 0 |
| 2911 | 0 |
| 2912 | 0 |
| 2913 | 0 |
| 2914 | 0 |
| 2915 | 0 |
| 2916 | 0 |
| 2917 | 0 |
| 2918 | 0 |
| 2919 | 0 |
| 2920 | 0 |
| 2921 | 0 |
| 2922 | 0 |
| 2923 | 0 |
| 2924 | 0 |
| 2925 | 0 |
| 2926 | 0 |
| 2927 | 0 |
| 2928 | 0 |
| 2929 | 0 |
| 2930 | 0 |
| 2931 | 0 |
| 2932 | 0 |
| 2933 | 0 |
| 2934 | 0 |
| 2935 | 0 |
| 2936 | 0 |
| 2937 | 0 |
| 2938 | 0 |
| 2939 | 0 |
| 2940 | 0 |
| 2941 | 0 |
| 2942 | 0 |
| 2943 | 0 |
| 2944 | 0 |
| 2945 | 0 |
| 2946 | 0 |
| 2947 | 0 |
| 2948 | 0 |
| 2949 | 0 |
| 2950 | 0 |
| 2951 | 0 |
| 2952 | 0 |
| 2953 | 0 |
| 2954 | 0 |
| 2955 | 0 |
| 2956 | 0 |
| 2957 | 0 |
| 2958 | 0 |
| 2959 | 0 |
| 2960 | 0 |
| 2961 | 0 |
| 2962 | 0 |
| 2963 | 0 |
| 2964 | 0 |
| 2965 | 0 |
| 2966 | 0 |
| 2967 | 0 |
| 2968 | 0 |
| 2969 | 0 |
| 2970 | 0 |
| 2971 | 0 |
| 2972 | 0 |
| 2973 | 0 |
| 2974 | 0 |
| 2975 | 0 |
| 2976 | 0 |
| 2977 | 0 |
| 2978 | 0 |
| 2979 | 0 |
| 2980 | 0 |
| 2981 | 0 |
| 2982 | 0 |
| 2983 | 0 |
| 2984 | 0 |
| 2985 | 0 |
| 2986 | 0 |
| 2987 | 0 |
| 2988 | 0 |
| 2989 | 0 |
| 2990 | 0 |
| 2991 | 0 |
| 2992 | 0 |
| 2993 | 0 |
| 2994 | 0 |
| 2995 | 0 |
| 2996 | 0 |
| 2997 | 0 |
| 2998 | 0 |
| 2999 | 0 |
| 3000 | 0 |
| 3001 | 0 |
| 3002 | 0 |
| 3003 | 0 |
| 3004 | 0 |
| 3005 | 0 |
| 3006 | 0 |
| 3007 | 0 |
| 3008 | 0 |
| 3009 | 0 |
| 3010 | 0 |
| 3011 | 0 |
| 3012 | 0 |
| 3013 | 0 |
| 3014 | 0 |
| 3015 | 0 |
| 3016 | 0 |
| 3017 | 0 |
| 3018 | 0 |
| 3019 | 0 |
| 3020 | 0 |
| 3021 | 0 |
| 3022 | 0 |
| 3023 | 0 |
| 3024 | 0 |
| 3025 | 0 |
| 3026 | 0 |
| 3027 | 0 |
| 3028 | 0 |
| 3029 | 0 |
| 3030 | 0 |
| 3031 | 0 |
| 3032 | 0 |
| 3033 | 0 |
| 3034 | 0 |
| 3035 | 0 |
| 3036 | 0 |
| 3037 | 0 |
| 3038 | 0 |
| 3039 | 0 |
| 3040 | 0 |
| 3041 | 0 |
| 3042 | 0 |
| 3043 | 0 |
| 3044 | 0 |
| 3045 | 0 |
| 3046 | 0 |
| 3047 | 0 |
| 3048 | 0 |
| 3049 | 0 |
| 3050 | 0 |
| 3051 | 0 |
| 3052 | 0 |
| 3053 | 0 |
| 3054 | 0 |
| 3055 | 0 |
| 3056 | 0 |
| 3057 | 0 |
| 3058 | 0 |
| 3059 | 0 |
| 3060 | 0 |
| 3061 | 0 |
| 3062 | 0 |
| 3063 | 0 |
| 3064 | 0 |
| 3065 | 0 |
| 3066 | 0 |
| 3067 | 0 |
| 3068 | 0 |
| 3069 | 0 |
| 3070 | 0 |
| 3071 | 0 |
| 3072 | 0 |
| 3073 | 0 |
| 3074 | 0 |
| 3075 | 0 |
| 3076 | 0 |
| 3077 | 0 |
| 3078 | 0 |
| 3079 | 0 |
| 3080 | 0 |
| 3081 | 0 |
| 3082 | 0 |
| 3083 | 0 |
| 3084 | 0 |
| 3085 | 0 |
| 3086 | 0 |
| 3087 | 0 |
| 3088 | 0 |
| 3089 | 0 |
| 3090 | 0 |
| 3091 | 0 |
| 3092 | 0 |
| 3093 | 0 |
| 3094 | 0 |
| 3095 | 0 |
| 3096 | 0 |
| 3097 | 0 |
| 3098 | 0 |
| 3099 | 0 |
| 3100 | 0 |
| 3101 | 0 |
| 3102 | 0 |
| 3103 | 0 |
| 3104 | 0 |
| 3105 | 0 |
| 3106 | 0 |
| 3107 | 0 |
| 3108 | 0 |
| 3109 | 0 |
| 3110 | 0 |
| 3111 | 0 |
| 3112 | 0 |
| 3113 | 0 |
| 3114 | 0 |
| 3115 | 0 |
| 3116 | 0 |
| 3117 | 0 |
| 3118 | 0 |
| 3119 | 0 |
| 3120 | 0 |
| 3121 | 0 |
| 3122 | 0 |
| 3123 | 0 |
| 3124 | 0 |
| 3125 | 0 |
| 3126 | 0 |
| 3127 | 0 |
| 3128 | 0 |
| 3129 | 0 |
| 3130 | 0 |
| 3131 | 0 |
| 3132 | 0 |
| 3133 | 0 |
| 3134 | 0 |
| 3135 | 0 |
| 3136 | 0 |
| 3137 | 0 |
| 3138 | 0 |
| 3139 | 0 |
| 3140 | 0 |
| 3141 | 0 |
| 3142 | 0 |
| 3143 | 0 |
| 3144 | 0 |
| 3145 | 0 |
| 3146 | 0 |
| 3147 | 0 |
| 3148 | 0 |
| 3149 | 0 |
| 3150 | 0 |
| 3151 | 0 |
| 3152 | 0 |
| 3153 | 0 |
| 3154 | 0 |
| 3155 | 0 |
| 3156 | 0 |
| 3157 | 0 |
| 3158 | 0 |
| 3159 | 0 |
| 3160 | 0 |
| 3161 | 0 |
| 3162 | 0 |
| 3163 | 0 |
| 3164 | 0 |
| 3165 | 0 |
| 3166 | 0 |
| 3167 | 0 |
| 3168 | 0 |
| 3169 | 0 |
| 3170 | 0 |
| 3171 | 0 |
| 3172 | 0 |
| 3173 | 0 |
| 3174 | 0 |
| 3175 | 0 |
| 3176 | 0 |
| 3177 | 0 |
| 3178 | 0 |
| 3179 | 0 |
| 3180 | 0 |
| 3181 | 0 |
| 3182 | 0 |
| 3183 | 0 |
| 3184 | 0 |
| 3185 | 0 |
| 3186 | 0 |
| 3187 | 0 |
| 3188 | 0 |
| 3189 | 0 |
| 3190 | 0 |
| 3191 | 0 |
| 3192 | 0 |
| 3193 | 0 |
| 3194 | 0 |
| 3195 | 0 |
| 3196 | 0 |
| 3197 | 0 |
| 3198 | 0 |
| 3199 | 0 |
| 3200 | 0 |
| 3201 | 0 |
| 3202 | 0 |
| 3203 | 0 |
| 3204 | 0 |
| 3205 | 0 |
| 3206 | 0 |
| 3207 | 0 |
| 3208 | 0 |
| 3209 | 0 |
| 3210 | 0 |
| 3211 | 0 |
| 3212 | 0 |
| 3213 | 0 |
| 3214 | 0 |
| 3215 | 0 |
| 3216 | 0 |
| 3217 | 0 |
| 3218 | 0 |
| 3219 | 0 |
| 3220 | 0 |
| 3221 | 0 |
| 3222 | 0 |
| 3223 | 0 |
| 3224 | 0 |
| 3225 | 0 |
| 3226 | 0 |
| 3227 | 0 |
| 3228 | 0 |
| 3229 | 0 |
| 3230 | 0 |
| 3231 | 0 |
| 3232 | 0 |
| 3233 | 0 |
| 3234 | 0 |
| 3235 | 0 |
| 3236 | 0 |
| 3237 | 0 |
| 3238 | 0 |
| 3239 | 0 |
| 3240 | 0 |
| 3241 | 0 |
| 3242 | 0 |
| 3243 | 0 |
| 3244 | 0 |
| 3245 | 0 |
| 3246 | 0 |
| 3247 | 0 |
| 3248 | 0 |
| 3249 | 0 |
| 3250 | 0 |
| 3251 | 0 |
| 3252 | 0 |
| 3253 | 0 |
| 3254 | 0 |
| 3255 | 0 |
| 3256 | 0 |
| 3257 | 0 |
| 3258 | 0 |
| 3259 | 0 |
| 3260 | 0 |
| 3261 | 0 |
| 3262 | 0 |
| 3263 | 0 |
| 3264 | 0 |
| 3265 | 0 |
| 3266 | 0 |
| 3267 | 0 |
| 3268 | 0 |
| 3269 | 0 |
| 3270 | 0 |
| 3271 | 0 |
| 3272 | 0 |
| 3273 | 0 |
| 3274 | 0 |
| 3275 | 0 |
| 3276 | 0 |
| 3277 | 0 |
| 3278 | 0 |
| 3279 | 0 |
| 3280 | 0 |
| 3281 | 0 |
| 3282 | 0 |
| 3283 | 0 |
| 3284 | 0 |
| 3285 | 0 |
| 3286 | 0 |
| 3287 | 0 |
| 3288 | 0 |
| 3289 | 0 |
| 3290 | 0 |
| 3291 | 0 |
| 3292 | 0 |
| 3293 | 0 |
| 3294 | 0 |
| 3295 | 0 |
| 3296 | 0 |
| 3297 | 0 |
| 3298 | 0 |
| 3299 | 0 |
| 3300 | 0 |
| 3301 | 0 |
| 3302 | 0 |
| 3303 | 0 |
| 3304 | 0 |
| 3305 | 0 |
| 3306 | 0 |
| 3307 | 0 |
| 3308 | 0 |
| 3309 | 0 |
| 3310 | 0 |
| 3311 | 0 |
| 3312 | 0 |
| 3313 | 0 |
| 3314 | 0 |
| 3315 | 0 |
| 3316 | 0 |
| 3317 | 0 |
| 3318 | 0 |
| 3319 | 0 |
| 3320 | 0 |
| 3321 | 0 |
| 3322 | 0 |
| 3323 | 0 |
| 3324 | 0 |
| 3325 | 0 |
| 3326 | 0 |
| 3327 | 0 |
| 3328 | 0 |
| 3329 | 0 |
| 3330 | 0 |
| 3331 | 0 |
| 3332 | 0 |
| 3333 | 0 |
| 3334 | 0 |
| 3335 | 0 |
| 3336 | 0 |
| 3337 | 0 |
| 3338 | 0 |
| 3339 | 0 |
| 3340 | 0 |
| 3341 | 0 |
| 3342 | 0 |
| 3343 | 0 |
| 3344 | 0 |
| 3345 | 0 |
| 3346 | 0 |
| 3347 | 0 |
| 3348 | 0 |
| 3349 | 0 |
| 3350 | 0 |
| 3351 | 0 |
| 3352 | 0 |
| 3353 | 0 |
| 3354 | 0 |
| 3355 | 0 |
| 3356 | 0 |
| 3357 | 0 |
| 3358 | 0 |
| 3359 | 0 |
| 3360 | 0 |
| 3361 | 0 |
| 3362 | 0 |
| 3363 | 0 |
| 3364 | 0 |
| 3365 | 0 |
| 3366 | 0 |
| 3367 | 0 |
| 3368 | 0 |
| 3369 | 0 |
| 3370 | 0 |
| 3371 | 0 |
| 3372 | 0 |
| 3373 | 0 |
| 3374 | 0 |
| 3375 | 0 |
| 3376 | 0 |
| 3377 | 0 |
| 3378 | 0 |
| 3379 | 0 |
| 3380 | 0 |
| 3381 | 0 |
| 3382 | 0 |
| 3383 | 0 |
| 3384 | 0 |
| 3385 | 0 |
| 3386 | 0 |
| 3387 | 0 |
| 3388 | 0 |
| 3389 | 0 |
| 3390 | 0 |
| 3391 | 0 |
| 3392 | 0 |
| 3393 | 0 |
| 3394 | 0 |
| 3395 | 0 |
| 3396 | 0 |
| 3397 | 0 |
| 3398 | 0 |
| 3399 | 0 |
| 3400 | 0 |
| 3401 | 0 |
| 3402 | 0 |
| 3403 | 0 |
| 3404 | 0 |